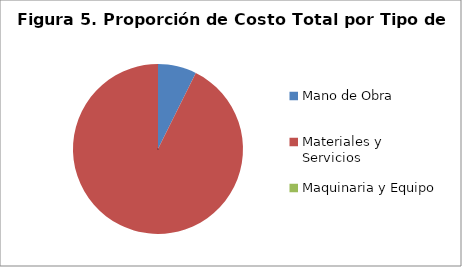
| Category | Series 0 |
|---|---|
| Mano de Obra | 687000 |
| Materiales y Servicios | 8674600 |
| Maquinaria y Equipo | 0 |